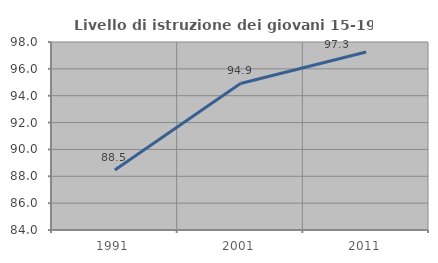
| Category | Livello di istruzione dei giovani 15-19 anni |
|---|---|
| 1991.0 | 88.462 |
| 2001.0 | 94.915 |
| 2011.0 | 97.26 |